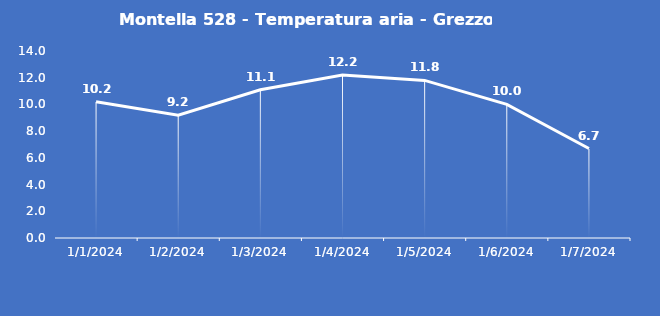
| Category | Montella 528 - Temperatura aria - Grezzo (°C) |
|---|---|
| 1/1/24 | 10.2 |
| 1/2/24 | 9.2 |
| 1/3/24 | 11.1 |
| 1/4/24 | 12.2 |
| 1/5/24 | 11.8 |
| 1/6/24 | 10 |
| 1/7/24 | 6.7 |